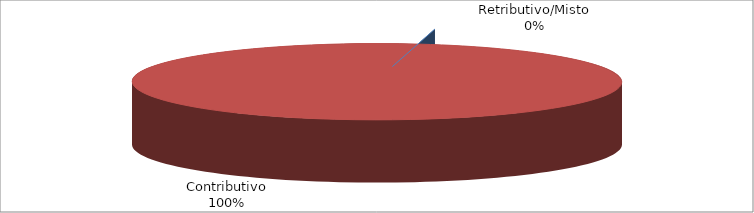
| Category | Series 1 |
|---|---|
| Retributivo/Misto | 0 |
| Contributivo | 40109 |